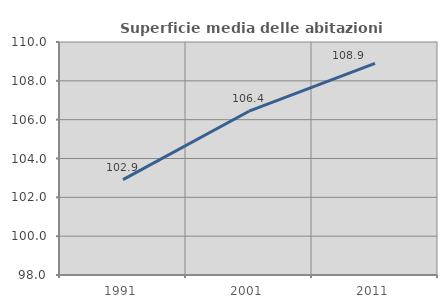
| Category | Superficie media delle abitazioni occupate |
|---|---|
| 1991.0 | 102.915 |
| 2001.0 | 106.435 |
| 2011.0 | 108.903 |